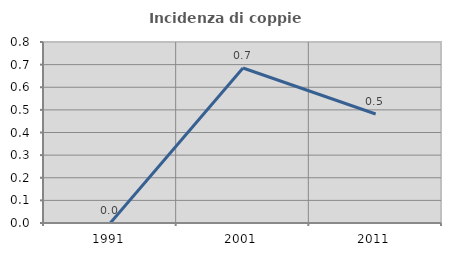
| Category | Incidenza di coppie miste |
|---|---|
| 1991.0 | 0 |
| 2001.0 | 0.685 |
| 2011.0 | 0.482 |